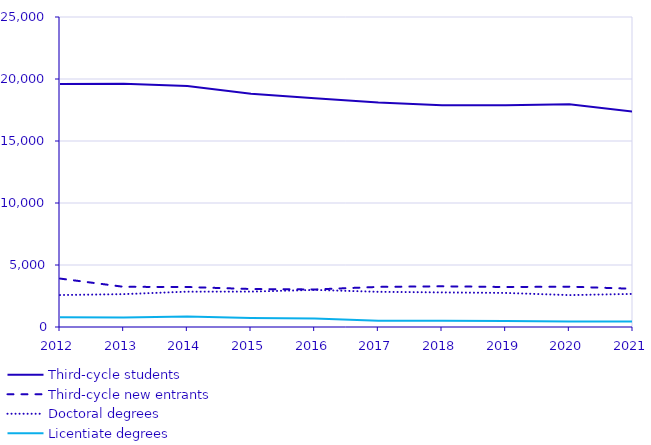
| Category | Third-cycle students | Third-cycle new entrants | Doctoral degrees | Licentiate degrees |
|---|---|---|---|---|
| 2012.0 | 19591 | 3906 | 2578 | 787 |
| 2013.0 | 19611 | 3241 | 2650 | 771 |
| 2014.0 | 19439 | 3226 | 2851 | 838 |
| 2015.0 | 18804 | 3063 | 2855 | 731 |
| 2016.0 | 18444 | 3027 | 2990 | 689 |
| 2017.0 | 18103 | 3234 | 2838 | 501 |
| 2018.0 | 17886 | 3282 | 2789 | 502 |
| 2019.0 | 17892 | 3226 | 2747 | 483 |
| 2020.0 | 17964 | 3254 | 2572 | 449 |
| 2021.0 | 17371 | 3082 | 2667 | 438 |